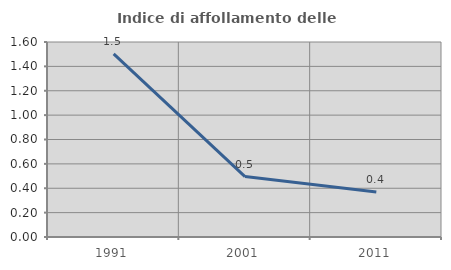
| Category | Indice di affollamento delle abitazioni  |
|---|---|
| 1991.0 | 1.502 |
| 2001.0 | 0.496 |
| 2011.0 | 0.37 |